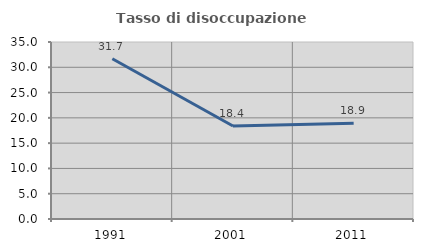
| Category | Tasso di disoccupazione giovanile  |
|---|---|
| 1991.0 | 31.698 |
| 2001.0 | 18.378 |
| 2011.0 | 18.919 |